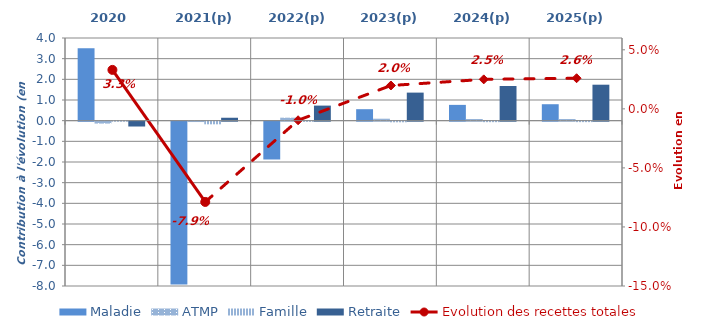
| Category | Maladie | ATMP | Famille | Retraite |
|---|---|---|---|---|
| 2020 | 3.503 | -0.093 | 0.018 | -0.235 |
| 2021(p) | -7.876 | -0.018 | -0.129 | 0.141 |
| 2022(p) | -1.83 | 0.145 | -0.009 | 0.729 |
| 2023(p) | 0.555 | 0.095 | -0.03 | 1.358 |
| 2024(p) | 0.764 | 0.081 | -0.024 | 1.677 |
| 2025(p) | 0.796 | 0.08 | -0.022 | 1.74 |